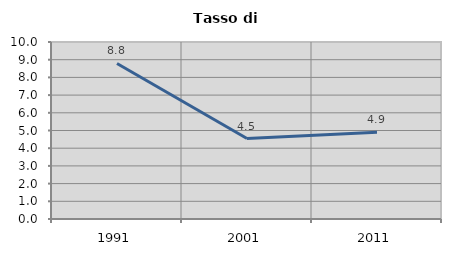
| Category | Tasso di disoccupazione   |
|---|---|
| 1991.0 | 8.787 |
| 2001.0 | 4.545 |
| 2011.0 | 4.902 |